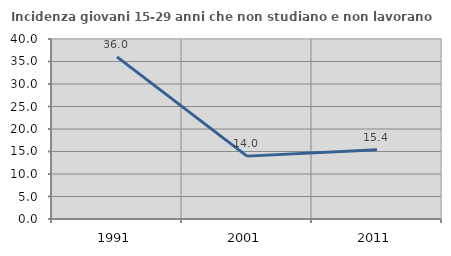
| Category | Incidenza giovani 15-29 anni che non studiano e non lavorano  |
|---|---|
| 1991.0 | 36.025 |
| 2001.0 | 13.973 |
| 2011.0 | 15.385 |